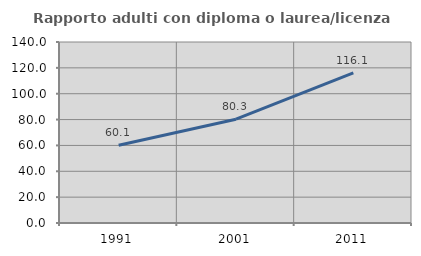
| Category | Rapporto adulti con diploma o laurea/licenza media  |
|---|---|
| 1991.0 | 60.105 |
| 2001.0 | 80.287 |
| 2011.0 | 116.09 |